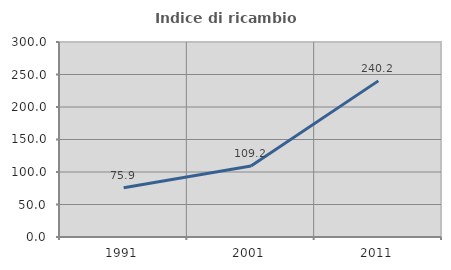
| Category | Indice di ricambio occupazionale  |
|---|---|
| 1991.0 | 75.888 |
| 2001.0 | 109.176 |
| 2011.0 | 240.193 |